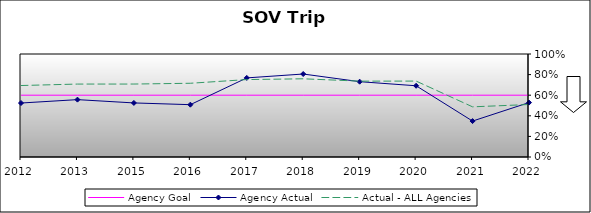
| Category | Agency Goal | Agency Actual | Actual - ALL Agencies |
|---|---|---|---|
| 2012.0 | 0.6 | 0.524 | 0.694 |
| 2013.0 | 0.6 | 0.557 | 0.708 |
| 2015.0 | 0.6 | 0.525 | 0.708 |
| 2016.0 | 0.6 | 0.508 | 0.716 |
| 2017.0 | 0.6 | 0.768 | 0.752 |
| 2018.0 | 0.6 | 0.806 | 0.759 |
| 2019.0 | 0.6 | 0.731 | 0.736 |
| 2020.0 | 0.6 | 0.692 | 0.737 |
| 2021.0 | 0.6 | 0.349 | 0.487 |
| 2022.0 | 0.6 | 0.528 | 0.509 |